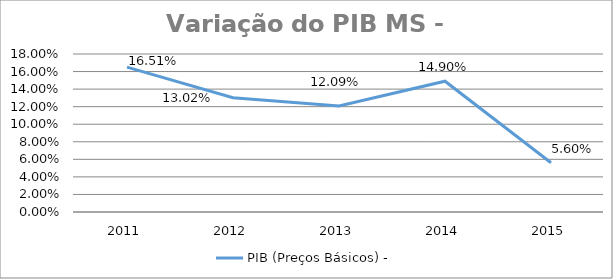
| Category | PIB (Preços Básicos) - |
|---|---|
| 2011.0 | 0.165 |
| 2012.0 | 0.13 |
| 2013.0 | 0.121 |
| 2014.0 | 0.149 |
| 2015.0 | 0.056 |